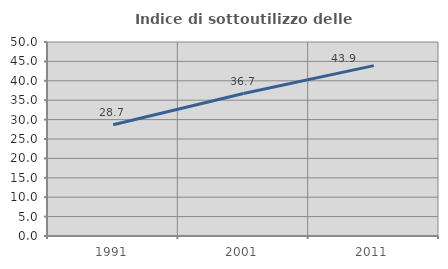
| Category | Indice di sottoutilizzo delle abitazioni  |
|---|---|
| 1991.0 | 28.678 |
| 2001.0 | 36.721 |
| 2011.0 | 43.904 |